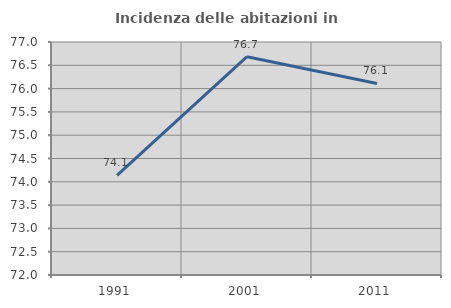
| Category | Incidenza delle abitazioni in proprietà  |
|---|---|
| 1991.0 | 74.14 |
| 2001.0 | 76.685 |
| 2011.0 | 76.11 |